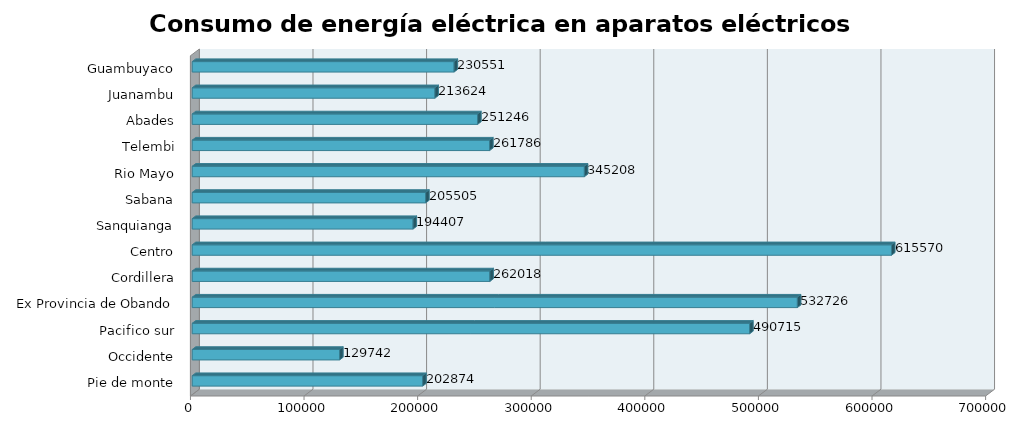
| Category | Series 0 |
|---|---|
| Pie de monte | 202874.416 |
| Occidente | 129742.397 |
| Pacifico sur | 490715.409 |
| Ex Provincia de Obando | 532726.183 |
| Cordillera | 262017.869 |
| Centro | 615570.493 |
| Sanquianga | 194407.082 |
| Sabana | 205505.276 |
| Rio Mayo | 345207.991 |
| Telembi | 261786.25 |
| Abades | 251246.439 |
| Juanambu | 213623.933 |
| Guambuyaco | 230551.019 |